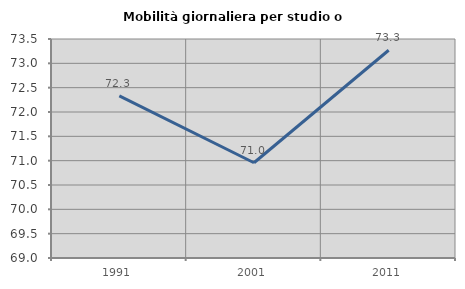
| Category | Mobilità giornaliera per studio o lavoro |
|---|---|
| 1991.0 | 72.332 |
| 2001.0 | 70.957 |
| 2011.0 | 73.269 |